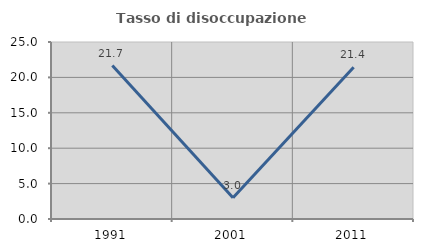
| Category | Tasso di disoccupazione giovanile  |
|---|---|
| 1991.0 | 21.678 |
| 2001.0 | 3 |
| 2011.0 | 21.429 |